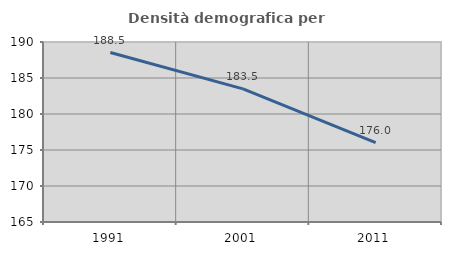
| Category | Densità demografica |
|---|---|
| 1991.0 | 188.538 |
| 2001.0 | 183.486 |
| 2011.0 | 176.026 |